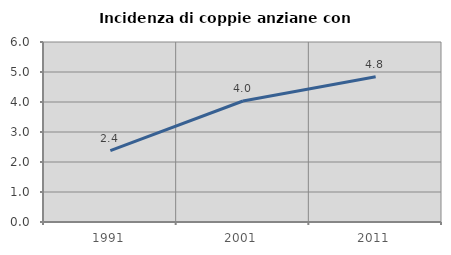
| Category | Incidenza di coppie anziane con figli |
|---|---|
| 1991.0 | 2.376 |
| 2001.0 | 4.033 |
| 2011.0 | 4.839 |